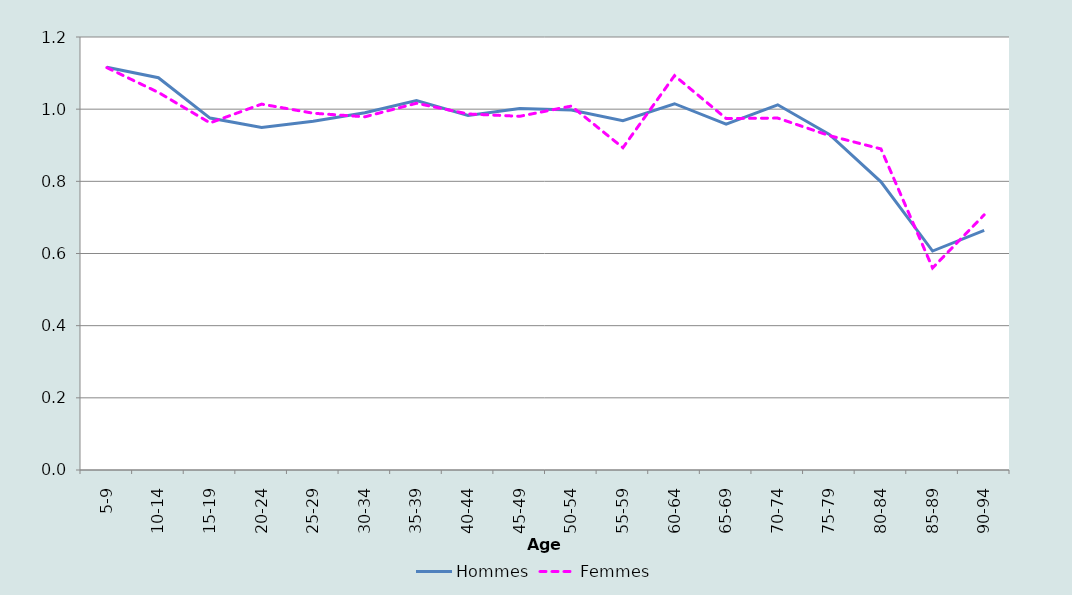
| Category | Hommes | Femmes |
|---|---|---|
| 5-9 | 1.116 | 1.115 |
| 10-14 | 1.087 | 1.046 |
| 15-19 | 0.975 | 0.962 |
| 20-24 | 0.949 | 1.014 |
| 25-29 | 0.966 | 0.989 |
| 30-34 | 0.99 | 0.979 |
| 35-39 | 1.024 | 1.016 |
| 40-44 | 0.983 | 0.987 |
| 45-49 | 1.002 | 0.98 |
| 50-54 | 0.997 | 1.009 |
| 55-59 | 0.968 | 0.893 |
| 60-64 | 1.015 | 1.093 |
| 65-69 | 0.958 | 0.974 |
| 70-74 | 1.012 | 0.975 |
| 75-79 | 0.93 | 0.927 |
| 80-84 | 0.799 | 0.89 |
| 85-89 | 0.607 | 0.56 |
| 90-94 | 0.664 | 0.707 |